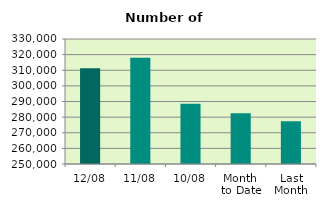
| Category | Series 0 |
|---|---|
| 12/08 | 311308 |
| 11/08 | 318028 |
| 10/08 | 288492 |
| Month 
to Date | 282455.2 |
| Last
Month | 277312.476 |